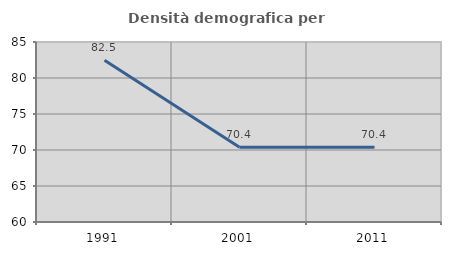
| Category | Densità demografica |
|---|---|
| 1991.0 | 82.454 |
| 2001.0 | 70.37 |
| 2011.0 | 70.37 |